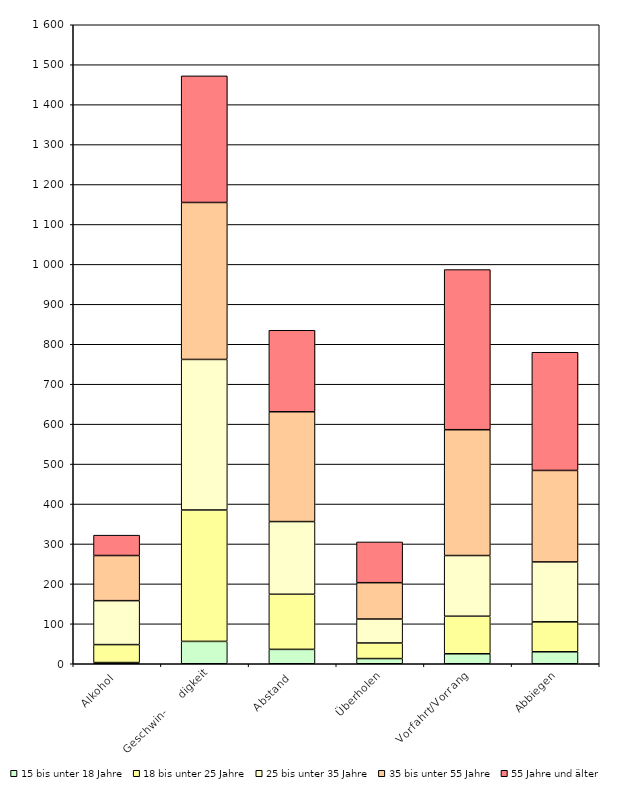
| Category |    15 bis unter 18 Jahre |    18 bis unter 25 Jahre |    25 bis unter 35 Jahre |    35 bis unter 55 Jahre |    55 Jahre und älter |
|---|---|---|---|---|---|
| 0 | 3 | 45 | 110 | 113 | 51 |
| 1 | 56 | 329 | 377 | 393 | 317 |
| 2 | 36 | 138 | 182 | 275 | 204 |
| 3 | 13 | 39 | 60 | 91 | 102 |
| 4 | 25 | 94 | 152 | 315 | 401 |
| 5 | 30 | 75 | 150 | 229 | 296 |